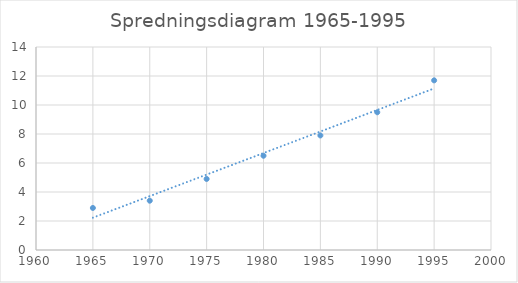
| Category | Series 0 |
|---|---|
| 1965.0 | 2.9 |
| 1970.0 | 3.4 |
| 1975.0 | 4.9 |
| 1980.0 | 6.5 |
| 1985.0 | 7.9 |
| 1990.0 | 9.5 |
| 1995.0 | 11.7 |